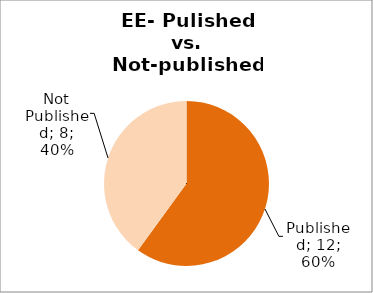
| Category | Series 0 |
|---|---|
| Published | 12 |
| Not Published | 8 |